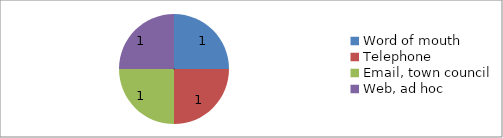
| Category | Series 1 | Series 0 |
|---|---|---|
| Word of mouth | 1 | 1 |
| Telephone | 1 | 1 |
| Email, town council | 1 | 1 |
| Web, ad hoc | 1 | 1 |